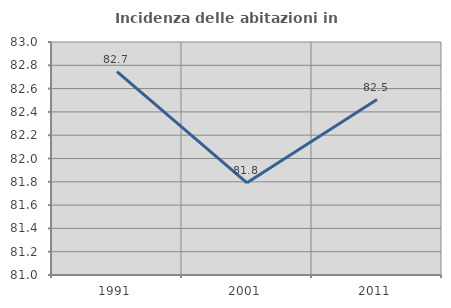
| Category | Incidenza delle abitazioni in proprietà  |
|---|---|
| 1991.0 | 82.746 |
| 2001.0 | 81.791 |
| 2011.0 | 82.506 |